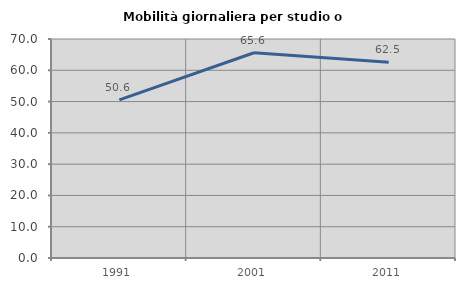
| Category | Mobilità giornaliera per studio o lavoro |
|---|---|
| 1991.0 | 50.555 |
| 2001.0 | 65.603 |
| 2011.0 | 62.544 |